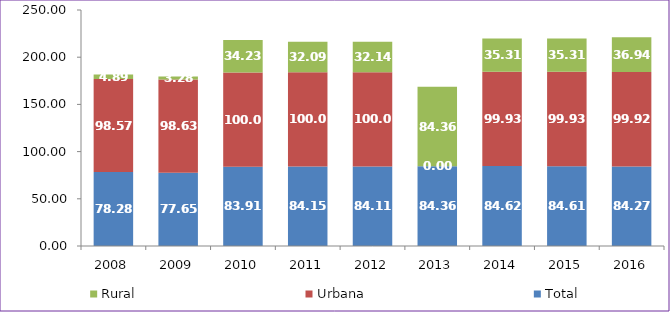
| Category | Total | Urbana | Rural |
|---|---|---|---|
| 2008.0 | 78.28 | 98.57 | 4.89 |
| 2009.0 | 77.65 | 98.63 | 3.28 |
| 2010.0 | 83.91 | 100 | 34.23 |
| 2011.0 | 84.15 | 100 | 32.09 |
| 2012.0 | 84.11 | 100 | 32.14 |
| 2013.0 | 84.36 | 0 | 84.36 |
| 2014.0 | 84.62 | 99.93 | 35.31 |
| 2015.0 | 84.61 | 99.93 | 35.31 |
| 2016.0 | 84.27 | 99.92 | 36.94 |